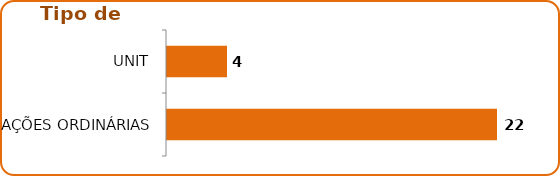
| Category | Tipo de Ativo |
|---|---|
| AÇÕES ORDINÁRIAS | 22 |
| UNIT | 4 |